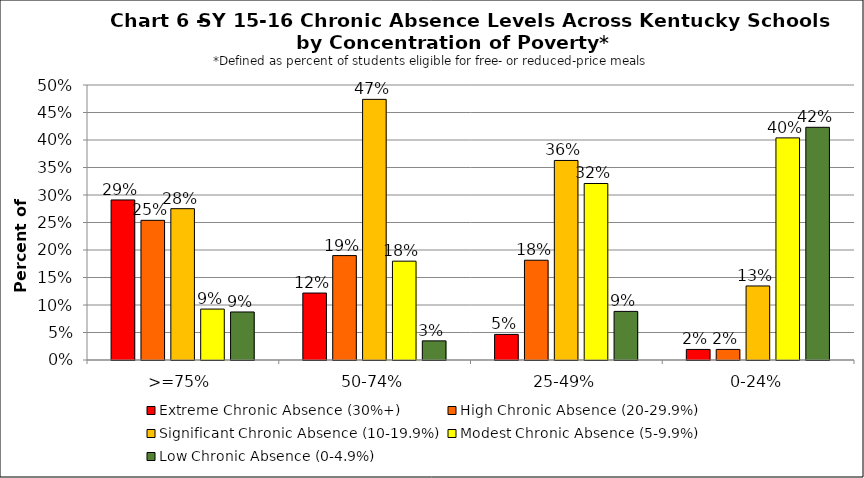
| Category | Extreme Chronic Absence (30%+) | High Chronic Absence (20-29.9%) | Significant Chronic Absence (10-19.9%) | Modest Chronic Absence (5-9.9%) | Low Chronic Absence (0-4.9%) |
|---|---|---|---|---|---|
| 0 | 0.291 | 0.254 | 0.275 | 0.093 | 0.087 |
| 1 | 0.122 | 0.19 | 0.474 | 0.18 | 0.035 |
| 2 | 0.047 | 0.181 | 0.363 | 0.321 | 0.088 |
| 3 | 0.019 | 0.019 | 0.135 | 0.404 | 0.423 |